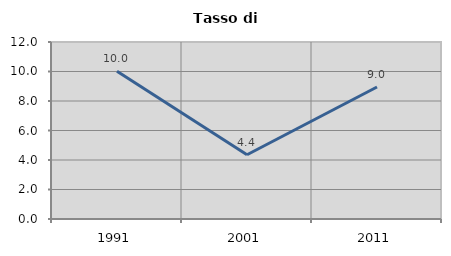
| Category | Tasso di disoccupazione   |
|---|---|
| 1991.0 | 10.022 |
| 2001.0 | 4.355 |
| 2011.0 | 8.952 |